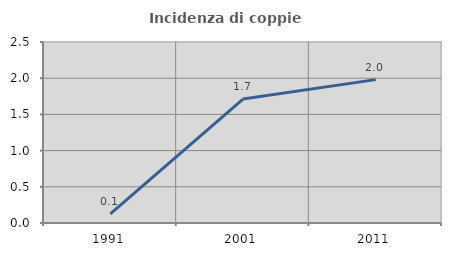
| Category | Incidenza di coppie miste |
|---|---|
| 1991.0 | 0.125 |
| 2001.0 | 1.712 |
| 2011.0 | 1.98 |